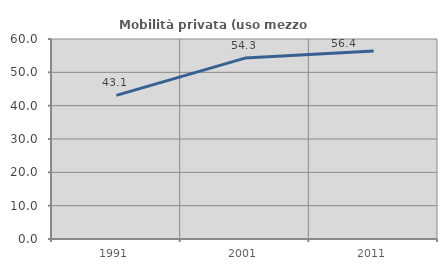
| Category | Mobilità privata (uso mezzo privato) |
|---|---|
| 1991.0 | 43.103 |
| 2001.0 | 54.264 |
| 2011.0 | 56.41 |